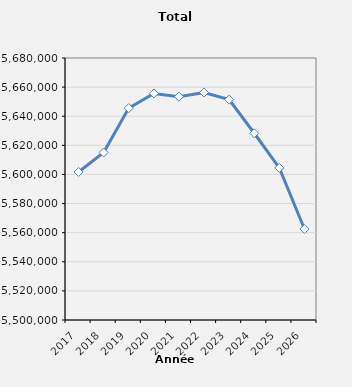
| Category | Total effectifs |
|---|---|
| 2017.0 | 5601699 |
| 2018.0 | 5615100 |
| 2019.0 | 5645593 |
| 2020.0 | 5655644 |
| 2021.0 | 5653435 |
| 2022.0 | 5656300 |
| 2023.0 | 5651400 |
| 2024.0 | 5628300 |
| 2025.0 | 5604500 |
| 2026.0 | 5562500 |